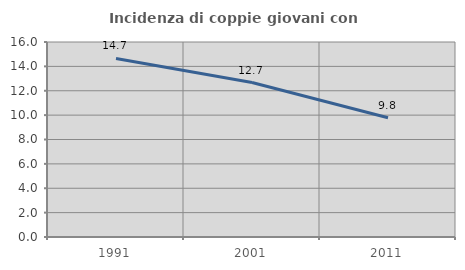
| Category | Incidenza di coppie giovani con figli |
|---|---|
| 1991.0 | 14.652 |
| 2001.0 | 12.671 |
| 2011.0 | 9.78 |